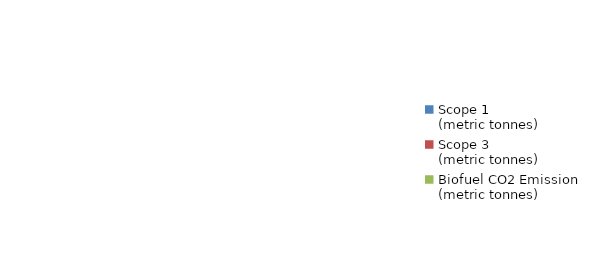
| Category | Series 0 |
|---|---|
| Scope 1
(metric tonnes) | 0 |
| Scope 3
(metric tonnes) | 0 |
| Biofuel CO2 Emission
(metric tonnes) | 0 |